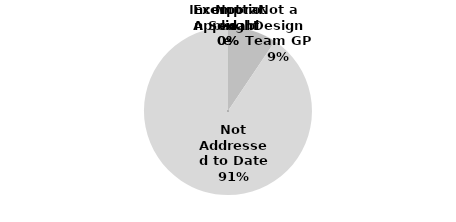
| Category | Series 0 |
|---|---|
| Not a Design Team GP | 5 |
| Not Addressed to Date | 48 |
| Not Applicable | 0 |
| Incorporated | 0 |
| Exemption Sought | 0 |